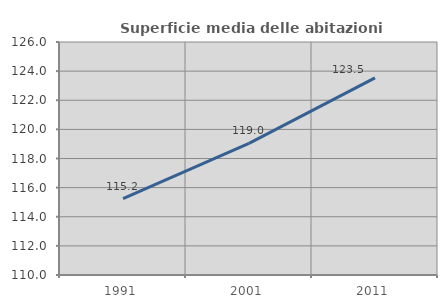
| Category | Superficie media delle abitazioni occupate |
|---|---|
| 1991.0 | 115.247 |
| 2001.0 | 119.037 |
| 2011.0 | 123.54 |